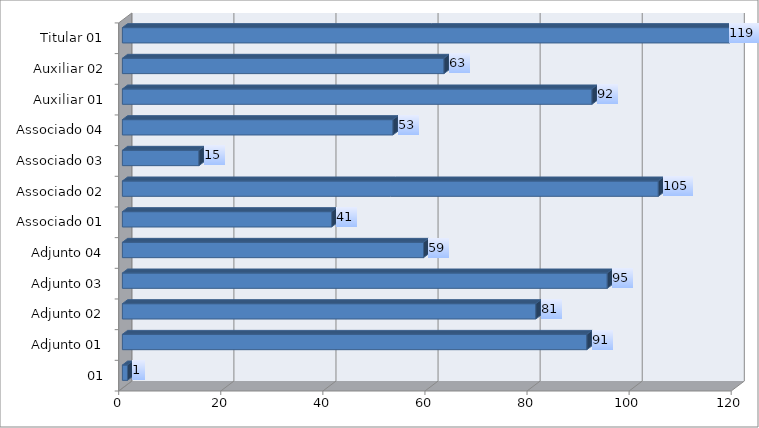
| Category | Total de produções |
|---|---|
| 01 | 1 |
| Adjunto 01 | 91 |
| Adjunto 02 | 81 |
| Adjunto 03 | 95 |
| Adjunto 04 | 59 |
| Associado 01 | 41 |
| Associado 02 | 105 |
| Associado 03 | 15 |
| Associado 04 | 53 |
| Auxiliar 01 | 92 |
| Auxiliar 02 | 63 |
| Titular 01 | 119 |